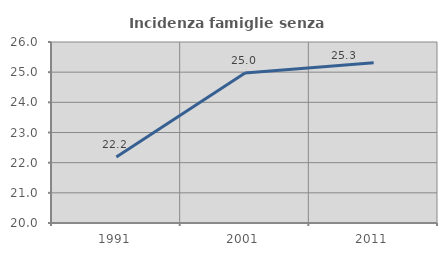
| Category | Incidenza famiglie senza nuclei |
|---|---|
| 1991.0 | 22.185 |
| 2001.0 | 24.975 |
| 2011.0 | 25.315 |